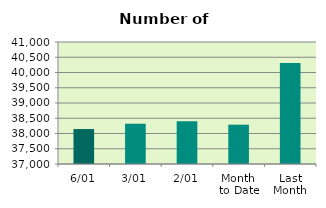
| Category | Series 0 |
|---|---|
| 6/01 | 38146 |
| 3/01 | 38320 |
| 2/01 | 38402 |
| Month 
to Date | 38289.333 |
| Last
Month | 40313.8 |